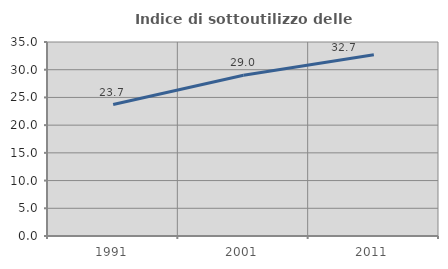
| Category | Indice di sottoutilizzo delle abitazioni  |
|---|---|
| 1991.0 | 23.716 |
| 2001.0 | 28.99 |
| 2011.0 | 32.702 |